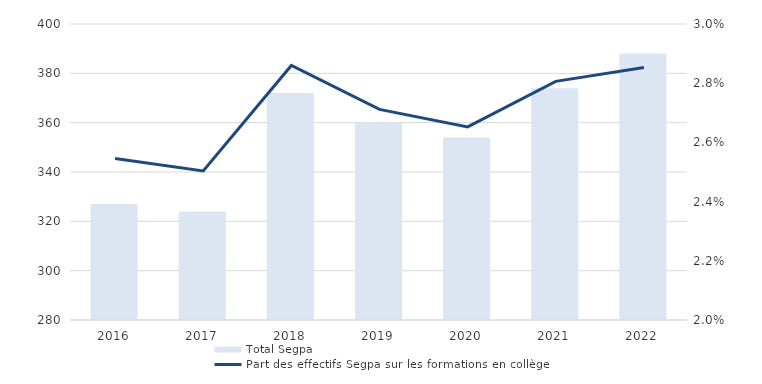
| Category | Total Segpa |
|---|---|
| 2016 | 327 |
| 2017 | 324 |
| 2018 | 372 |
| 2019 | 360 |
| 2020 | 354 |
| 2021 | 374 |
| 2022 | 388 |